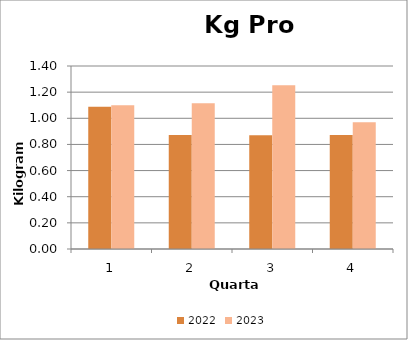
| Category | 2022 | 2023 |
|---|---|---|
| 0 | 1.088 | 1.1 |
| 1 | 0.872 | 1.116 |
| 2 | 0.869 | 1.252 |
| 3 | 0.872 | 0.97 |